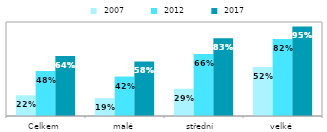
| Category |  2007 |  2012 |  2017 |
|---|---|---|---|
| Celkem | 0.22 | 0.48 | 0.639 |
| malé | 0.19 | 0.42 | 0.581 |
| střední  | 0.29 | 0.66 | 0.828 |
| velké | 0.52 | 0.82 | 0.953 |